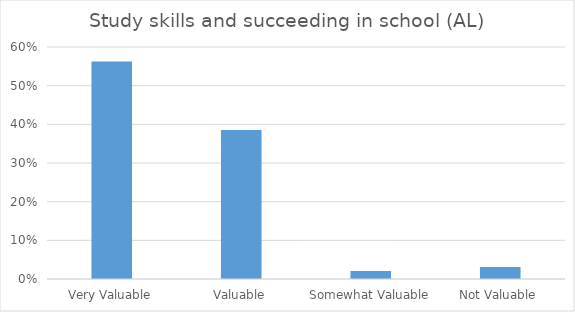
| Category | Study skills and succeeding in school (AL) |
|---|---|
| Very Valuable | 0.562 |
| Valuable | 0.385 |
| Somewhat Valuable | 0.021 |
| Not Valuable | 0.031 |